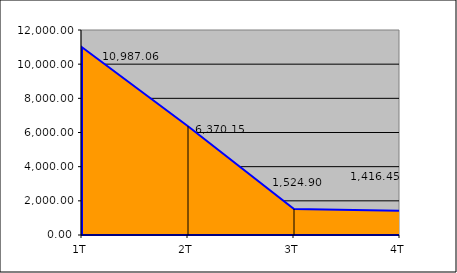
| Category | Series 0 |
|---|---|
| 1T | 10987.06 |
| 2T | 6370.15 |
| 3T | 1524.9 |
| 4T | 1416.445 |